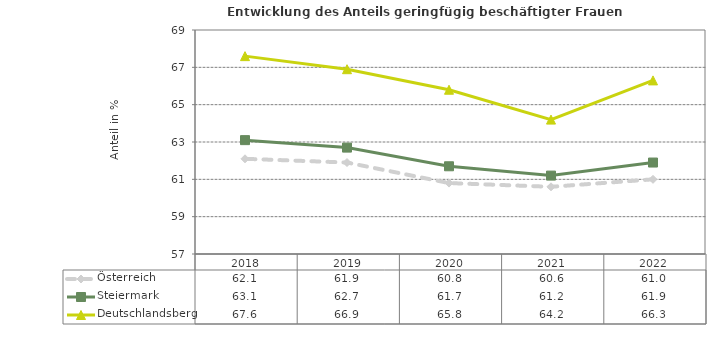
| Category | Österreich | Steiermark | Deutschlandsberg |
|---|---|---|---|
| 2022.0 | 61 | 61.9 | 66.3 |
| 2021.0 | 60.6 | 61.2 | 64.2 |
| 2020.0 | 60.8 | 61.7 | 65.8 |
| 2019.0 | 61.9 | 62.7 | 66.9 |
| 2018.0 | 62.1 | 63.1 | 67.6 |